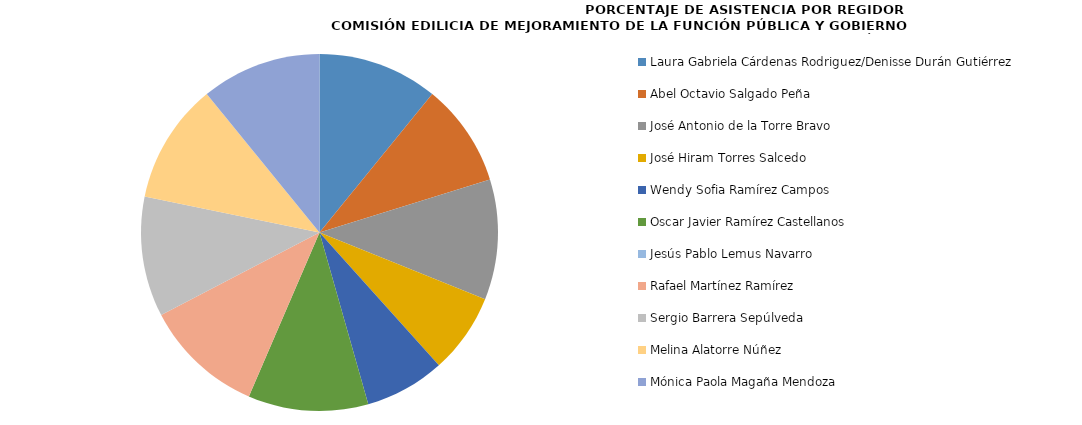
| Category | Series 0 |
|---|---|
| Laura Gabriela Cárdenas Rodriguez/Denisse Durán Gutiérrez | 100 |
| Abel Octavio Salgado Peña | 85.714 |
| José Antonio de la Torre Bravo | 100 |
| José Hiram Torres Salcedo | 66.667 |
| Wendy Sofia Ramírez Campos | 66.667 |
| Oscar Javier Ramírez Castellanos | 100 |
| Jesús Pablo Lemus Navarro  | 0 |
| Rafael Martínez Ramírez | 100 |
| Sergio Barrera Sepúlveda | 100 |
| Melina Alatorre Núñez | 100 |
| Mónica Paola Magaña Mendoza | 100 |